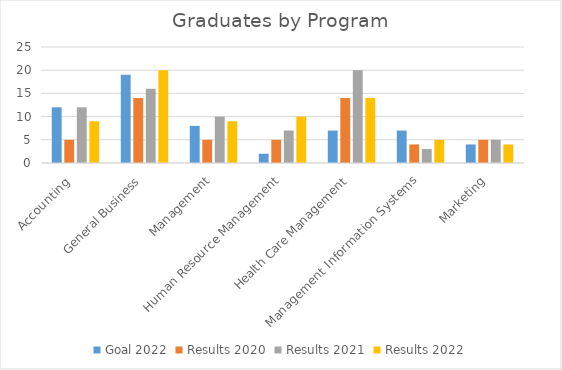
| Category | Goal 2022 | Results 2020 | Results 2021 | Results 2022 |
|---|---|---|---|---|
| Accounting  | 12 | 5 | 12 | 9 |
| General Business | 19 | 14 | 16 | 20 |
| Management | 8 | 5 | 10 | 9 |
| Human Resource Management | 2 | 5 | 7 | 10 |
| Health Care Management | 7 | 14 | 20 | 14 |
| Management Information Systems | 7 | 4 | 3 | 5 |
| Marketing | 4 | 5 | 5 | 4 |